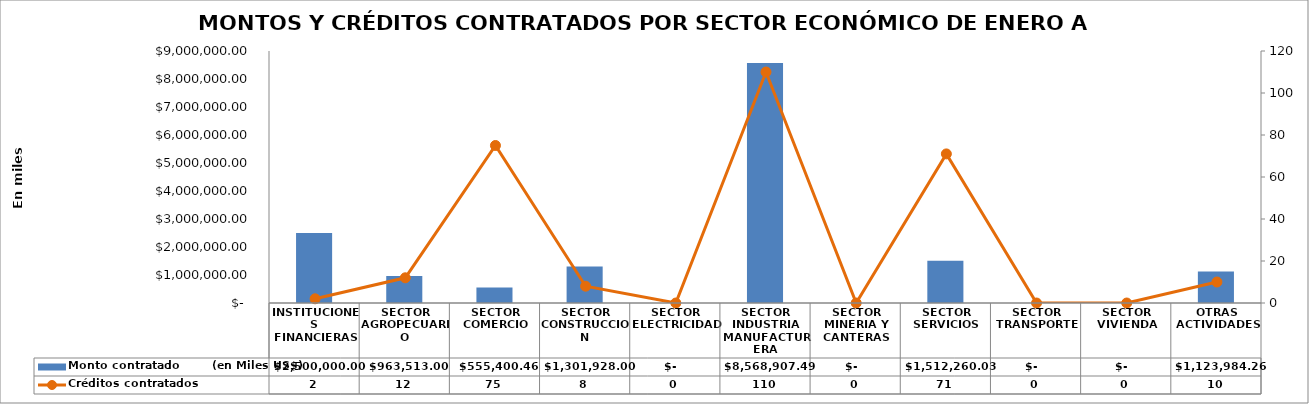
| Category | Monto contratado        (en Miles US$) |
|---|---|
| INSTITUCIONES FINANCIERAS | 2500000 |
| SECTOR AGROPECUARIO | 963513 |
| SECTOR COMERCIO | 555400.46 |
| SECTOR CONSTRUCCION | 1301928 |
| SECTOR ELECTRICIDAD | 0 |
| SECTOR INDUSTRIA MANUFACTURERA | 8568907.49 |
| SECTOR MINERIA Y CANTERAS | 0 |
| SECTOR SERVICIOS | 1512260.03 |
| SECTOR TRANSPORTE | 0 |
| SECTOR VIVIENDA | 0 |
| OTRAS ACTIVIDADES | 1123984.26 |